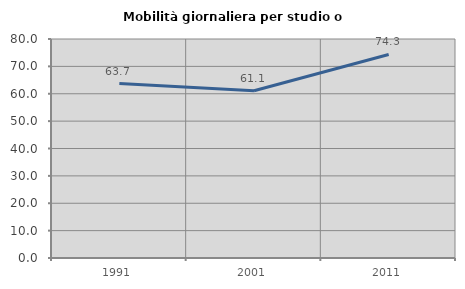
| Category | Mobilità giornaliera per studio o lavoro |
|---|---|
| 1991.0 | 63.735 |
| 2001.0 | 61.096 |
| 2011.0 | 74.346 |